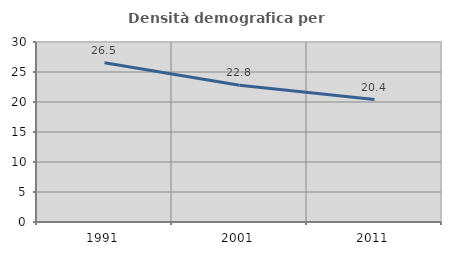
| Category | Densità demografica |
|---|---|
| 1991.0 | 26.545 |
| 2001.0 | 22.793 |
| 2011.0 | 20.398 |